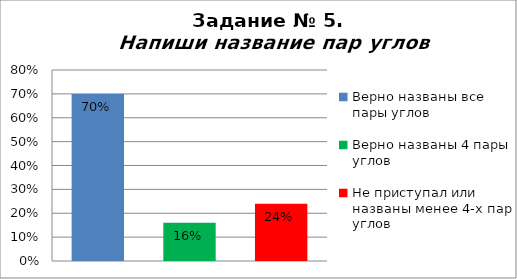
| Category | Напиши название пар углов |
|---|---|
| Верно названы все пары углов | 0.7 |
| Верно названы 4 пары углов | 0.16 |
| Не приступал или названы менее 4-х пар углов | 0.24 |